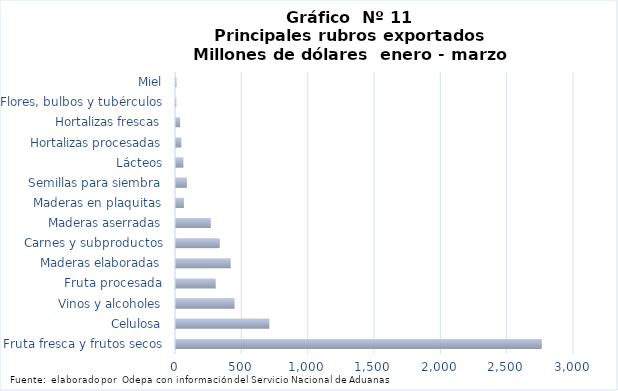
| Category | Series 7 |
|---|---|
| Fruta fresca y frutos secos | 2757167.434 |
| Celulosa | 703745.481 |
| Vinos y alcoholes | 441489.532 |
| Fruta procesada | 299416.123 |
| Maderas elaboradas | 412415.304 |
| Carnes y subproductos | 329765.128 |
| Maderas aserradas | 262523.243 |
| Maderas en plaquitas | 59624.116 |
| Semillas para siembra | 82145.395 |
| Lácteos | 55759.867 |
| Hortalizas procesadas | 40229.268 |
| Hortalizas frescas | 31079.993 |
| Flores, bulbos y tubérculos | 2261.714 |
| Miel | 3375.856 |